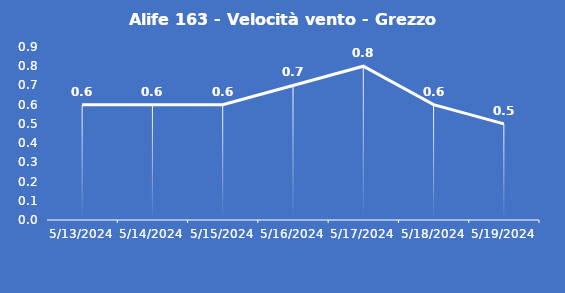
| Category | Alife 163 - Velocità vento - Grezzo (m/s) |
|---|---|
| 5/13/24 | 0.6 |
| 5/14/24 | 0.6 |
| 5/15/24 | 0.6 |
| 5/16/24 | 0.7 |
| 5/17/24 | 0.8 |
| 5/18/24 | 0.6 |
| 5/19/24 | 0.5 |